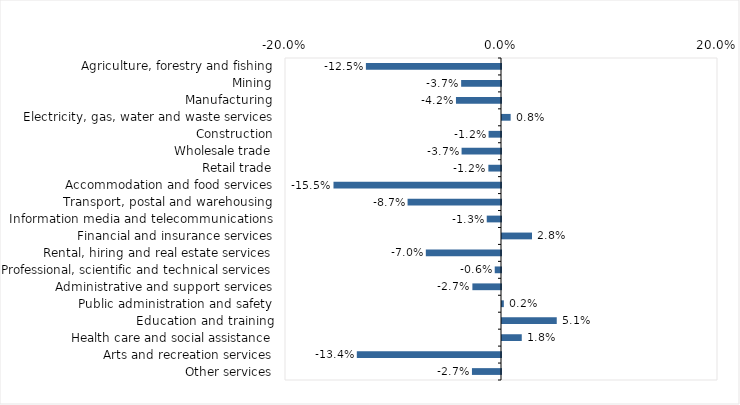
| Category | This week |
|---|---|
| Agriculture, forestry and fishing | -0.125 |
| Mining | -0.037 |
| Manufacturing | -0.042 |
| Electricity, gas, water and waste services | 0.008 |
| Construction | -0.012 |
| Wholesale trade | -0.036 |
| Retail trade | -0.012 |
| Accommodation and food services | -0.155 |
| Transport, postal and warehousing | -0.086 |
| Information media and telecommunications | -0.013 |
| Financial and insurance services | 0.028 |
| Rental, hiring and real estate services | -0.07 |
| Professional, scientific and technical services | -0.006 |
| Administrative and support services | -0.026 |
| Public administration and safety | 0.002 |
| Education and training | 0.051 |
| Health care and social assistance | 0.018 |
| Arts and recreation services | -0.134 |
| Other services | -0.027 |